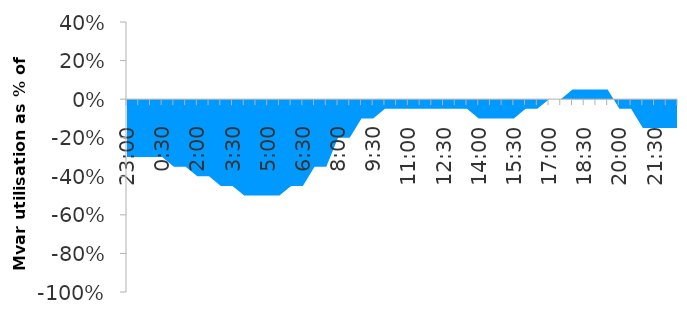
| Category | Series 0 |
|---|---|
| 0.9583333333333334 | -0.3 |
| 0.9791666666666666 | -0.3 |
| 0.0 | -0.3 |
| 0.020833333333333332 | -0.3 |
| 0.041666666666666664 | -0.35 |
| 0.0625 | -0.35 |
| 0.08333333333333333 | -0.4 |
| 0.10416666666666667 | -0.4 |
| 0.125 | -0.45 |
| 0.14583333333333334 | -0.45 |
| 0.16666666666666666 | -0.5 |
| 0.1875 | -0.5 |
| 0.20833333333333334 | -0.5 |
| 0.22916666666666666 | -0.5 |
| 0.25 | -0.45 |
| 0.2708333333333333 | -0.45 |
| 0.2916666666666667 | -0.35 |
| 0.3125 | -0.35 |
| 0.3333333333333333 | -0.2 |
| 0.3541666666666667 | -0.2 |
| 0.375 | -0.1 |
| 0.3958333333333333 | -0.1 |
| 0.4166666666666667 | -0.05 |
| 0.4375 | -0.05 |
| 0.4583333333333333 | -0.05 |
| 0.4791666666666667 | -0.05 |
| 0.5 | -0.05 |
| 0.5208333333333334 | -0.05 |
| 0.5416666666666666 | -0.05 |
| 0.5625 | -0.05 |
| 0.5833333333333334 | -0.1 |
| 0.6041666666666666 | -0.1 |
| 0.625 | -0.1 |
| 0.6458333333333334 | -0.1 |
| 0.6666666666666666 | -0.05 |
| 0.6875 | -0.05 |
| 0.7083333333333334 | 0 |
| 0.7291666666666666 | 0 |
| 0.75 | 0.05 |
| 0.7708333333333334 | 0.05 |
| 0.7916666666666666 | 0.05 |
| 0.8125 | 0.05 |
| 0.8333333333333334 | -0.05 |
| 0.8541666666666666 | -0.05 |
| 0.875 | -0.15 |
| 0.8958333333333334 | -0.15 |
| 0.9166666666666666 | -0.15 |
| 0.9375 | -0.15 |